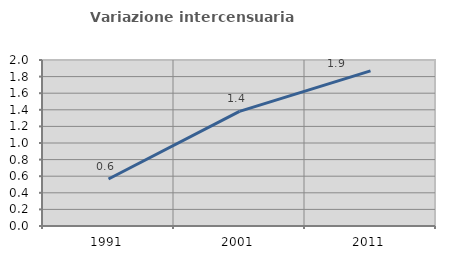
| Category | Variazione intercensuaria annua |
|---|---|
| 1991.0 | 0.566 |
| 2001.0 | 1.382 |
| 2011.0 | 1.87 |